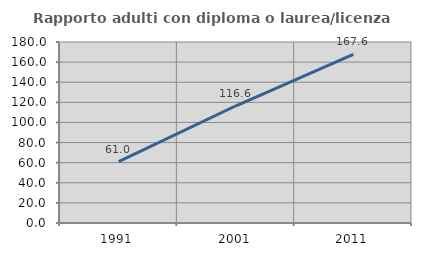
| Category | Rapporto adulti con diploma o laurea/licenza media  |
|---|---|
| 1991.0 | 61.049 |
| 2001.0 | 116.585 |
| 2011.0 | 167.576 |